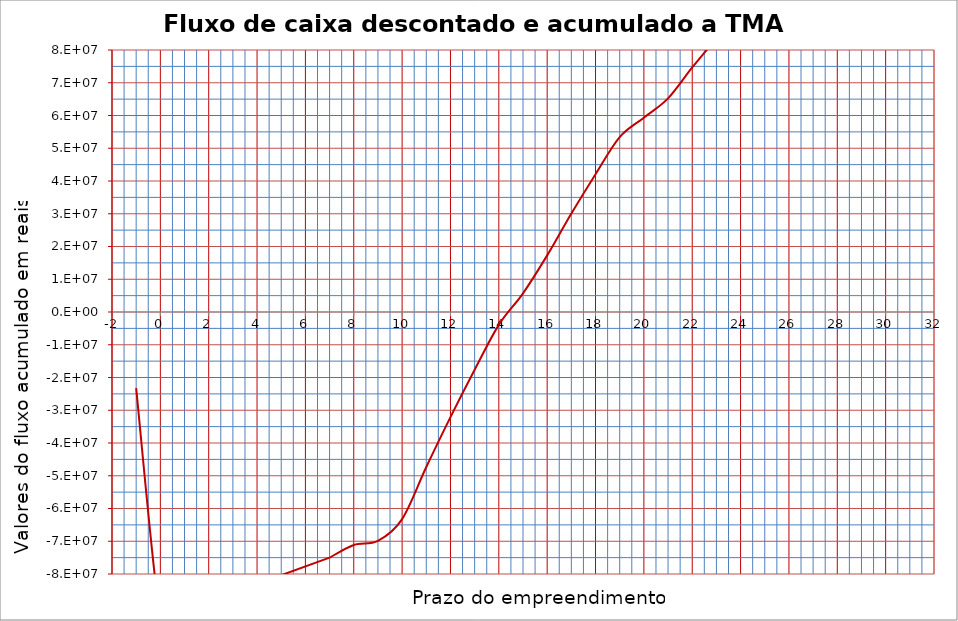
| Category | Series 0 |
|---|---|
| -1.0 | -23218272 |
| 0.0 | -93754491.2 |
| 1.0 | -87790883.731 |
| 2.0 | -84065303.981 |
| 3.0 | -88976548.868 |
| 4.0 | -97319865.564 |
| 5.0 | -89281054.579 |
| 6.0 | -81967406.796 |
| 7.0 | -75011993.909 |
| 8.0 | -71125761.295 |
| 9.0 | -69873502.16 |
| 10.0 | -63240436.924 |
| 11.0 | -47333880.086 |
| 12.0 | -32115301.086 |
| 13.0 | -17649736.745 |
| 14.0 | -3921856.073 |
| 15.0 | 5690703.365 |
| 16.0 | 17286355.382 |
| 17.0 | 30057757.292 |
| 18.0 | 42084219.428 |
| 19.0 | 53401615.12 |
| 20.0 | 59340469.577 |
| 21.0 | 65233175.008 |
| 22.0 | 74662049.51 |
| 23.0 | 83474390.087 |
| 24.0 | 91704038.549 |
| 25.0 | 99337028.346 |
| 26.0 | 106474052.123 |
| 27.0 | 113111690.515 |
| 28.0 | 119285498.974 |
| 29.0 | 125030648.268 |
| 30.0 | 130369280.816 |